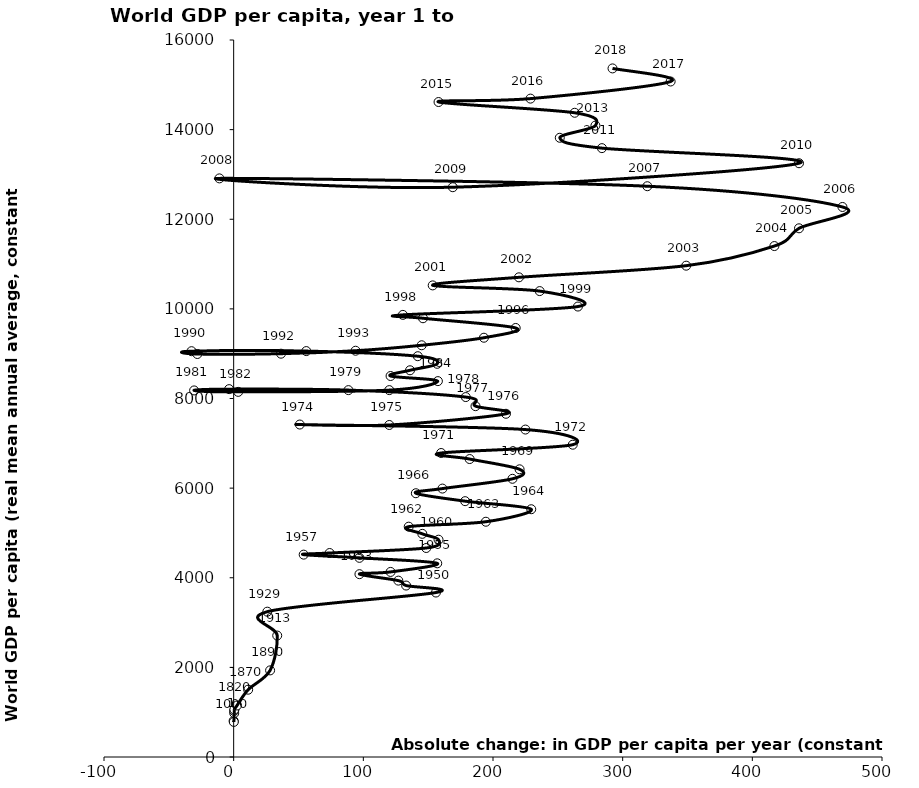
| Category | Series 0 |
|---|---|
| -0.02307543297312786 | 805.966 |
| 0.11477572316393655 | 782.914 |
| 0.40976336995924156 | 978.015 |
| 0.41842798112060847 | 1028.772 |
| 0.5490405482566416 | 1061.7 |
| 2.589998108253093 | 1149.561 |
| 11.191992837114816 | 1502 |
| 28.093023255813954 | 1933 |
| 33.58974358974359 | 2710 |
| 25.945945945945947 | 3243 |
| 156.0 | 3670 |
| 133.0 | 3826 |
| 127.0 | 3936 |
| 97.0 | 4080 |
| 121.0 | 4130 |
| 157.0 | 4322 |
| 97.0 | 4444 |
| 54.0 | 4516 |
| 74.0 | 4552 |
| 148.5 | 4664 |
| 158.0 | 4849 |
| 145.5 | 4980 |
| 135.0 | 5140 |
| 194.5 | 5250 |
| 229.5 | 5529 |
| 178.5 | 5709 |
| 140.5 | 5886 |
| 161.0 | 5990 |
| 215.0 | 6208 |
| 220.5 | 6420 |
| 182.0 | 6649 |
| 160.0 | 6784 |
| 261.5 | 6969 |
| 225.0 | 7307 |
| 51.0 | 7419 |
| 120.0 | 7409 |
| 210.0 | 7659 |
| 186.5 | 7829 |
| 179.0 | 8032 |
| 88.5 | 8187 |
| -3.5 | 8209 |
| -30.5 | 8180 |
| 3.5 | 8148 |
| 120.0 | 8187 |
| 157.5 | 8388 |
| 121.0 | 8502 |
| 136.0 | 8630 |
| 157.0 | 8774 |
| 142.0 | 8944 |
| 56.0 | 9058 |
| -32.5 | 9056 |
| -28.0 | 8993 |
| 36.5 | 9000 |
| 94.0 | 9066 |
| 145.0 | 9188 |
| 193.0 | 9356 |
| 217.5 | 9574 |
| 146.0 | 9791 |
| 130.5 | 9866 |
| 265.5 | 10052 |
| 236.0 | 10397 |
| 153.5 | 10524 |
| 220.0 | 10704 |
| 349.0 | 10964 |
| 417.0 | 11402 |
| 436.0 | 11798 |
| 469.5 | 12274 |
| 319.0 | 12737 |
| -11.0 | 12912 |
| 169.0 | 12715 |
| 436.0 | 13250 |
| 284.0 | 13587 |
| 251.5 | 13818 |
| 279.0 | 14090 |
| 263.0 | 14376 |
| 158.0 | 14616 |
| 228.907303578364 | 14692 |
| 336.9971367754788 | 15073.815 |
| 292.17966639422957 | 15365.994 |